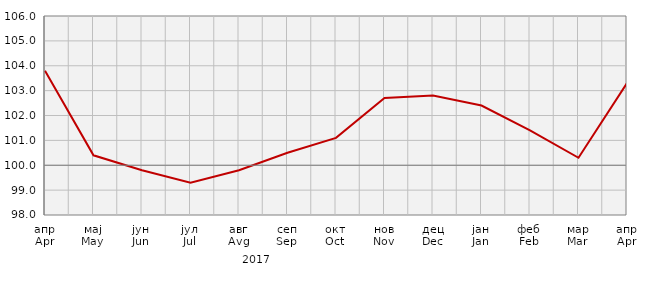
| Category | Индекси цијена произвођача
Producer price indices |
|---|---|
| апр
Apr | 103.8 |
| мај
May | 100.4 |
| јун
Jun | 99.8 |
| јул
Jul | 99.3 |
| авг
Avg | 99.8 |
| сеп
Sep | 100.5 |
| окт
Oct | 101.1 |
| нов
Nov | 102.7 |
| дец
Dec | 102.8 |
| јан
Jan | 102.4 |
| феб
Feb | 101.4 |
| мар
Mar | 100.3 |
| апр
Apr | 103.3 |